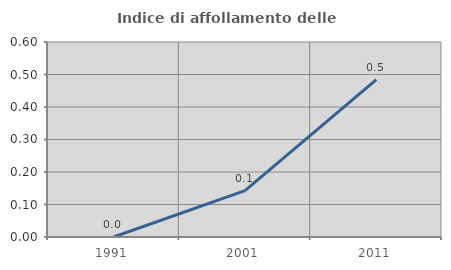
| Category | Indice di affollamento delle abitazioni  |
|---|---|
| 1991.0 | 0 |
| 2001.0 | 0.143 |
| 2011.0 | 0.484 |